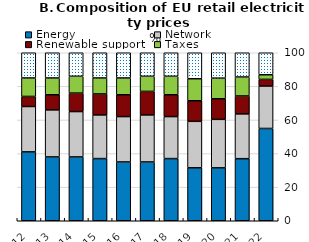
| Category | Energy | Network | Renewable support | Taxes | VAT |
|---|---|---|---|---|---|
| 2012.0 | 41 | 27 | 6 | 11 | 15 |
| 2013.0 | 38 | 28 | 9 | 10 | 15 |
| 2014.0 | 38 | 27 | 11 | 10 | 14 |
| 2015.0 | 37 | 26 | 12.5 | 9.5 | 15 |
| 2016.0 | 35 | 27 | 13 | 10 | 15 |
| 2017.0 | 35 | 28 | 14 | 9 | 14 |
| 2018.0 | 37 | 25 | 13 | 11 | 14 |
| 2019.0 | 31.523 | 27.658 | 12.241 | 13.116 | 15.462 |
| 2020.0 | 31.492 | 28.867 | 12.247 | 12.293 | 15.101 |
| 2021.0 | 36.949 | 26.664 | 10.674 | 11.279 | 14.434 |
| 2022.0 | 54.938 | 25.274 | 3.935 | 2.762 | 13.091 |